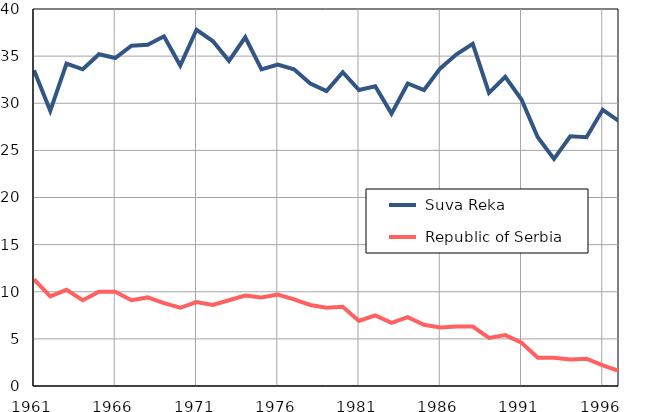
| Category |  Suva Reka |  Republic of Serbia |
|---|---|---|
| 1961.0 | 33.5 | 11.3 |
| 1962.0 | 29.2 | 9.5 |
| 1963.0 | 34.2 | 10.2 |
| 1964.0 | 33.6 | 9.1 |
| 1965.0 | 35.2 | 10 |
| 1966.0 | 34.8 | 10 |
| 1967.0 | 36.1 | 9.1 |
| 1968.0 | 36.2 | 9.4 |
| 1969.0 | 37.1 | 8.8 |
| 1970.0 | 34 | 8.3 |
| 1971.0 | 37.8 | 8.9 |
| 1972.0 | 36.6 | 8.6 |
| 1973.0 | 34.5 | 9.1 |
| 1974.0 | 37 | 9.6 |
| 1975.0 | 33.6 | 9.4 |
| 1976.0 | 34.1 | 9.7 |
| 1977.0 | 33.6 | 9.2 |
| 1978.0 | 32.1 | 8.6 |
| 1979.0 | 31.3 | 8.3 |
| 1980.0 | 33.3 | 8.4 |
| 1981.0 | 31.4 | 6.9 |
| 1982.0 | 31.8 | 7.5 |
| 1983.0 | 28.9 | 6.7 |
| 1984.0 | 32.1 | 7.3 |
| 1985.0 | 31.4 | 6.5 |
| 1986.0 | 33.7 | 6.2 |
| 1987.0 | 35.2 | 6.3 |
| 1988.0 | 36.3 | 6.3 |
| 1989.0 | 31.1 | 5.1 |
| 1990.0 | 32.8 | 5.4 |
| 1991.0 | 30.4 | 4.6 |
| 1992.0 | 26.4 | 3 |
| 1993.0 | 24.1 | 3 |
| 1994.0 | 26.5 | 2.8 |
| 1995.0 | 26.4 | 2.9 |
| 1996.0 | 29.3 | 2.2 |
| 1997.0 | 28.1 | 1.6 |